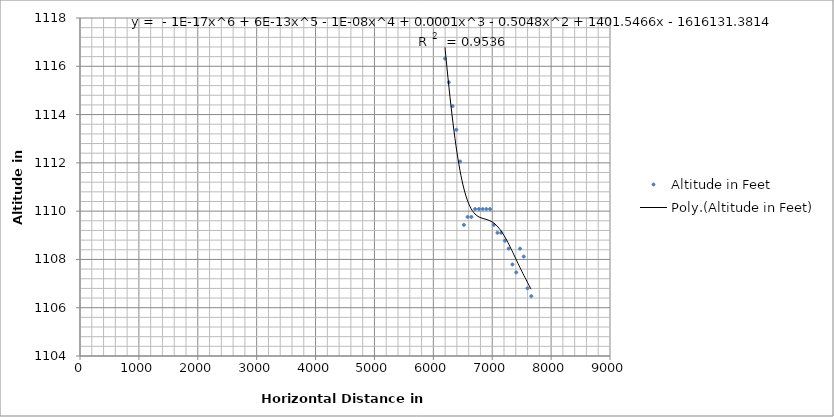
| Category | Altitude in Feet |
|---|---|
| 6197.741900552993 | 1116.32 |
| 6262.5258135221575 | 1115.336 |
| 6327.134539710661 | 1114.352 |
| 6391.047800046535 | 1113.368 |
| 6454.961060491265 | 1112.056 |
| 6518.763286509119 | 1109.431 |
| 6582.38603983488 | 1109.759 |
| 6646.41721819799 | 1109.759 |
| 6710.1578919864305 | 1110.087 |
| 6773.898565884347 | 1110.087 |
| 6837.232420070169 | 1110.087 |
| 6900.5728703590175 | 1110.087 |
| 6963.039156880539 | 1110.087 |
| 7026.14833664079 | 1109.431 |
| 7088.968327211254 | 1109.103 |
| 7152.591371223714 | 1109.103 |
| 7215.8141915149845 | 1108.775 |
| 7279.554866270669 | 1108.447 |
| 7343.295541135273 | 1107.791 |
| 7407.44406426593 | 1107.463 |
| 7471.474957974554 | 1108.447 |
| 7535.796068430255 | 1108.119 |
| 7599.598296304573 | 1106.807 |
| 7663.511558818095 | 1106.479 |